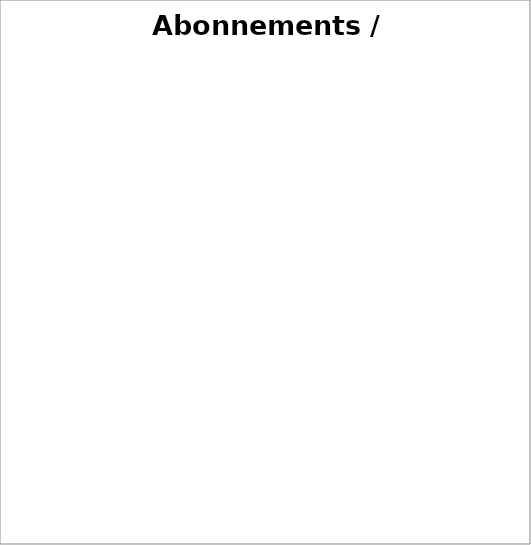
| Category | Series 0 |
|---|---|
| Eau | 0 |
| Electricité | 0 |
| Gaz | 0 |
| Mutuelle | 0 |
| Box internet TV téléphone | 0 |
| Forfait(s) mobile(s) | 0 |
| Vidéo (Netflix, Canal+…) | 0 |
| Musique (Spotify, Deezer…) | 0 |
| Shopping (Amazon Prime…) | 0 |
| Abonnements journaux et magazines | 0 |
| Sport (salle, club…) | 0 |
| Cotisations assos / partis politiques | 0 |
| Cantine / école | 0 |
| Nounou / ménage | 0 |
| Autre abonnement | 0 |
| Internet | 0 |
| Electricité | 0 |